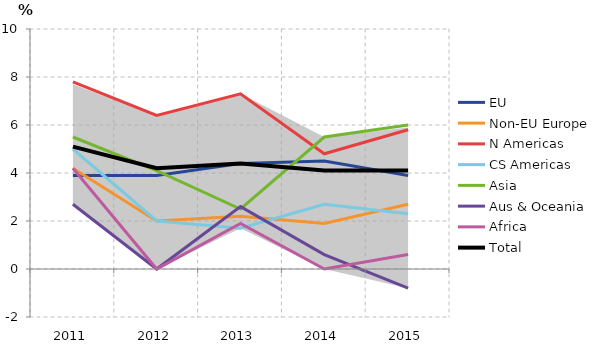
| Category | EU | Non-EU Europe | N Americas | CS Americas | Asia | Aus & Oceania | Africa | Total |
|---|---|---|---|---|---|---|---|---|
| 0 | 3.9 | 4.2 | 7.8 | 5 | 5.5 | 2.7 | 4.2 | 5.1 |
| 1 | 3.9 | 2 | 6.4 | 2 | 4.1 | 0 | 0 | 4.2 |
| 2 | 4.4 | 2.2 | 7.3 | 1.7 | 2.5 | 2.6 | 1.9 | 4.4 |
| 3 | 4.5 | 1.9 | 4.8 | 2.7 | 5.5 | 0.6 | 0 | 4.1 |
| 4 | 3.9 | 2.7 | 5.8 | 2.3 | 6 | -0.8 | 0.6 | 4.1 |